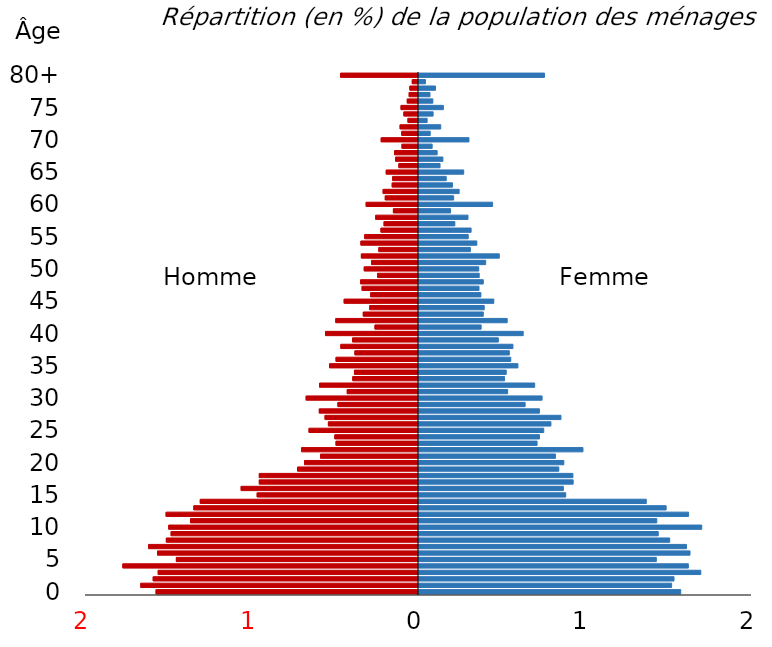
| Category | Homme | Femme |
|---|---|---|
| 0 | -1.576 | 1.572 |
| 1 | -1.668 | 1.517 |
| 2 | -1.593 | 1.532 |
| 3 | -1.563 | 1.692 |
| 4 | -1.776 | 1.618 |
| 5 | -1.454 | 1.425 |
| 6 | -1.568 | 1.628 |
| 7 | -1.621 | 1.606 |
| 8 | -1.514 | 1.506 |
| 9 | -1.486 | 1.437 |
| 10 | -1.5 | 1.698 |
| 11 | -1.369 | 1.428 |
| 12 | -1.516 | 1.619 |
| 13 | -1.349 | 1.484 |
| 14 | -1.311 | 1.365 |
| 15 | -0.969 | 0.881 |
| 16 | -1.065 | 0.867 |
| 17 | -0.956 | 0.926 |
| 18 | -0.956 | 0.924 |
| 19 | -0.726 | 0.84 |
| 20 | -0.685 | 0.87 |
| 21 | -0.589 | 0.82 |
| 22 | -0.702 | 0.985 |
| 23 | -0.495 | 0.709 |
| 24 | -0.502 | 0.723 |
| 25 | -0.657 | 0.749 |
| 26 | -0.541 | 0.792 |
| 27 | -0.561 | 0.853 |
| 28 | -0.596 | 0.723 |
| 29 | -0.484 | 0.637 |
| 30 | -0.675 | 0.739 |
| 31 | -0.428 | 0.533 |
| 32 | -0.594 | 0.695 |
| 33 | -0.395 | 0.514 |
| 34 | -0.385 | 0.524 |
| 35 | -0.534 | 0.594 |
| 36 | -0.495 | 0.551 |
| 37 | -0.382 | 0.543 |
| 38 | -0.467 | 0.564 |
| 39 | -0.396 | 0.477 |
| 40 | -0.558 | 0.626 |
| 41 | -0.261 | 0.373 |
| 42 | -0.497 | 0.53 |
| 43 | -0.332 | 0.386 |
| 44 | -0.293 | 0.392 |
| 45 | -0.446 | 0.449 |
| 46 | -0.287 | 0.372 |
| 47 | -0.339 | 0.36 |
| 48 | -0.347 | 0.386 |
| 49 | -0.245 | 0.362 |
| 50 | -0.326 | 0.359 |
| 51 | -0.281 | 0.4 |
| 52 | -0.343 | 0.482 |
| 53 | -0.238 | 0.309 |
| 54 | -0.346 | 0.347 |
| 55 | -0.323 | 0.296 |
| 56 | -0.225 | 0.313 |
| 57 | -0.207 | 0.215 |
| 58 | -0.257 | 0.294 |
| 59 | -0.151 | 0.189 |
| 60 | -0.314 | 0.442 |
| 61 | -0.2 | 0.208 |
| 62 | -0.212 | 0.241 |
| 63 | -0.158 | 0.201 |
| 64 | -0.155 | 0.164 |
| 65 | -0.194 | 0.268 |
| 66 | -0.118 | 0.126 |
| 67 | -0.138 | 0.144 |
| 68 | -0.144 | 0.109 |
| 69 | -0.099 | 0.079 |
| 70 | -0.224 | 0.3 |
| 71 | -0.1 | 0.067 |
| 72 | -0.111 | 0.131 |
| 73 | -0.063 | 0.049 |
| 74 | -0.088 | 0.085 |
| 75 | -0.105 | 0.146 |
| 76 | -0.067 | 0.083 |
| 77 | -0.056 | 0.066 |
| 78 | -0.052 | 0.099 |
| 79 | -0.037 | 0.039 |
| 80+ | -0.468 | 0.754 |